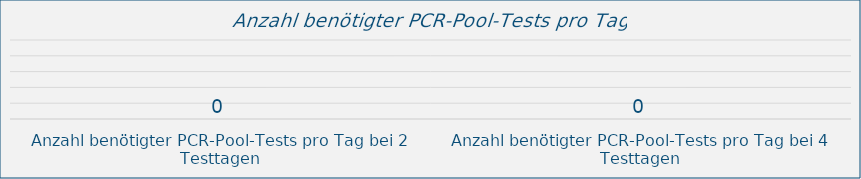
| Category | Series 0 |
|---|---|
| Anzahl benötigter PCR-Pool-Tests pro Tag bei 2 Testtagen | 0 |
| Anzahl benötigter PCR-Pool-Tests pro Tag bei 4 Testtagen | 0 |